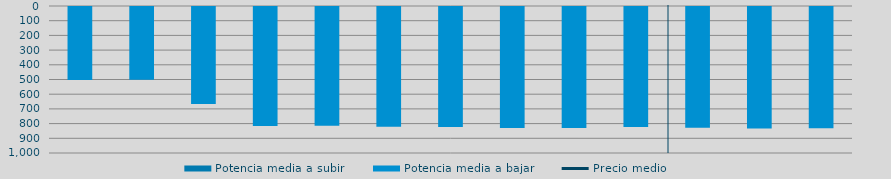
| Category | Potencia media a subir | Potencia media a bajar |
|---|---|---|
| 0 |  | 497.176 |
| 1 |  | 494.972 |
| 2 |  | 659.7 |
| 3 |  | 809.502 |
| 4 |  | 808.05 |
| 5 |  | 814.726 |
| 6 |  | 815.741 |
| 7 |  | 822.445 |
| 8 |  | 823.829 |
| 9 |  | 816.372 |
| 10 |  | 821.408 |
| 11 |  | 825.952 |
| 12 |  | 824.183 |